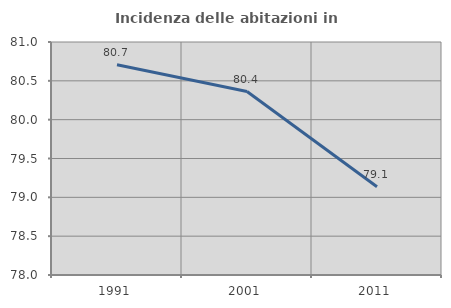
| Category | Incidenza delle abitazioni in proprietà  |
|---|---|
| 1991.0 | 80.707 |
| 2001.0 | 80.362 |
| 2011.0 | 79.135 |